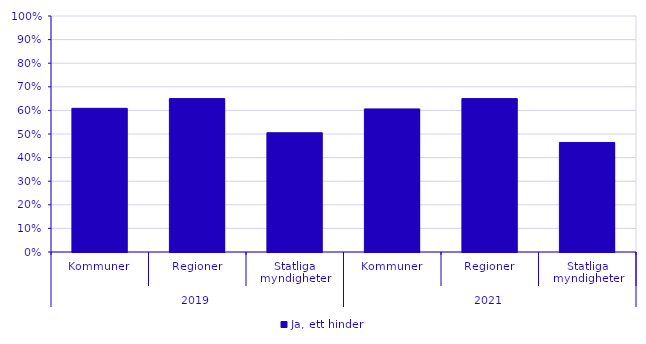
| Category | Ja, ett hinder |
|---|---|
| 0 | 0.609 |
| 1 | 0.65 |
| 2 | 0.505 |
| 3 | 0.606 |
| 4 | 0.65 |
| 5 | 0.464 |